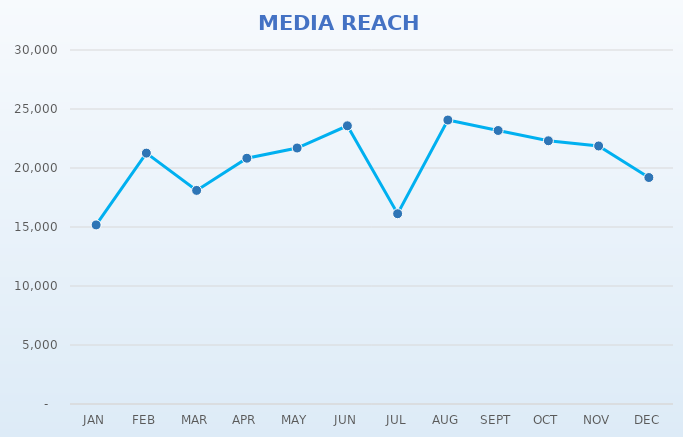
| Category | Series 0 | Series 1 |
|---|---|---|
|  JAN  |  | 15175 |
|  FEB  |  | 21262 |
|  MAR  |  | 18101 |
|  APR  |  | 20828 |
|  MAY  |  | 21694 |
|  JUN  |  | 23577 |
|  JUL  |  | 16125 |
|  AUG  |  | 24065 |
|  SEPT  |  | 23179 |
|  OCT  |  | 22307 |
|  NOV  |  | 21867 |
|  DEC  |  | 19193 |